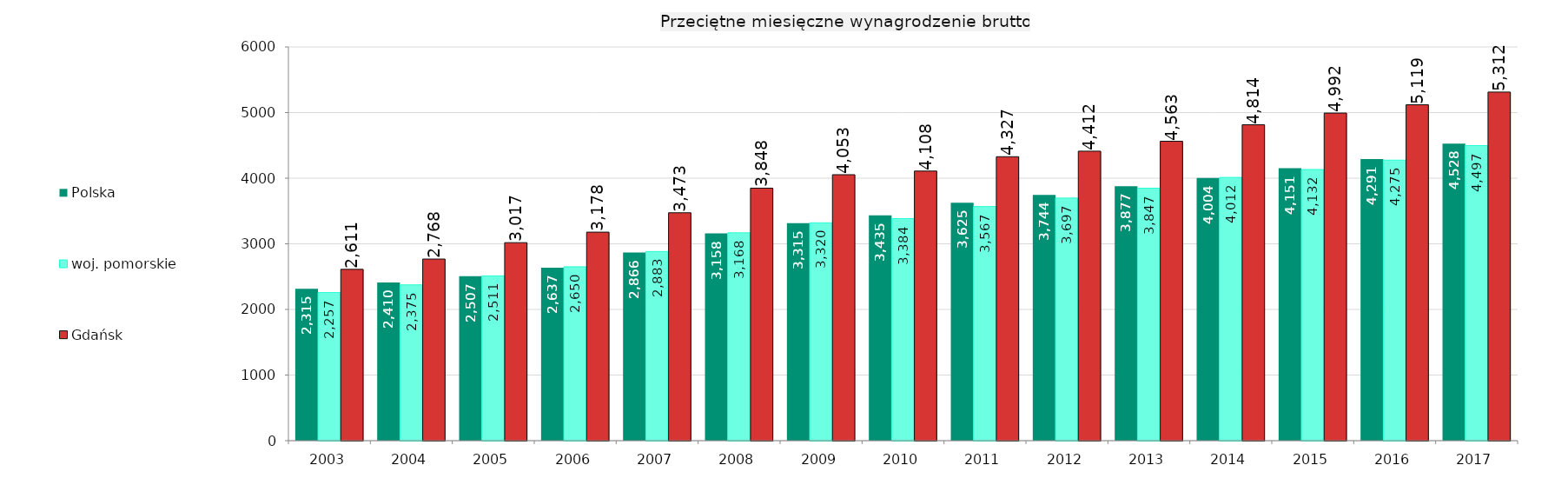
| Category | Polska | woj. pomorskie | Gdańsk |
|---|---|---|---|
| 2003.0 | 2314.66 | 2257.16 | 2611 |
| 2004.0 | 2409.69 | 2374.71 | 2767.68 |
| 2005.0 | 2506.93 | 2511.25 | 3017.45 |
| 2006.0 | 2636.81 | 2650.2 | 3177.7 |
| 2007.0 | 2866.04 | 2882.56 | 3473.08 |
| 2008.0 | 3158.48 | 3167.7 | 3847.9 |
| 2009.0 | 3315.38 | 3320.06 | 4053.17 |
| 2010.0 | 3435 | 3383.58 | 4108.37 |
| 2011.0 | 3625.21 | 3567.49 | 4327.35 |
| 2012.0 | 3744.38 | 3696.89 | 4411.71 |
| 2013.0 | 3877.43 | 3847.12 | 4562.66 |
| 2014.0 | 4003.99 | 4011.59 | 4814.14 |
| 2015.0 | 4150.88 | 4132.13 | 4992.14 |
| 2016.0 | 4290.52 | 4274.73 | 5118.59 |
| 2017.0 | 4527.89 | 4496.64 | 5312.48 |